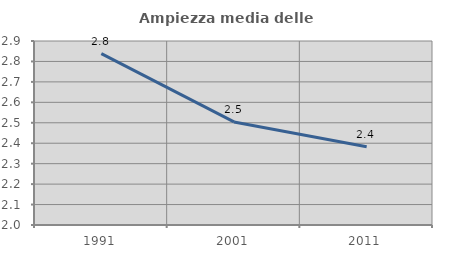
| Category | Ampiezza media delle famiglie |
|---|---|
| 1991.0 | 2.838 |
| 2001.0 | 2.504 |
| 2011.0 | 2.383 |